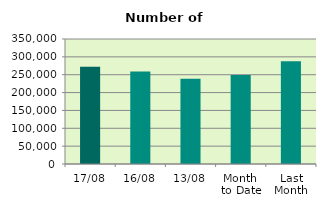
| Category | Series 0 |
|---|---|
| 17/08 | 272048 |
| 16/08 | 259308 |
| 13/08 | 238626 |
| Month 
to Date | 249141.667 |
| Last
Month | 287917.636 |